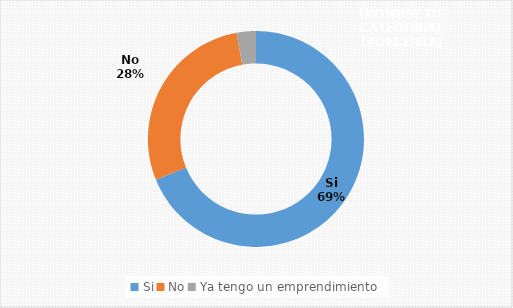
| Category | Series 0 |
|---|---|
| Si | 0.688 |
| No | 0.283 |
| Ya tengo un emprendimiento | 0.029 |